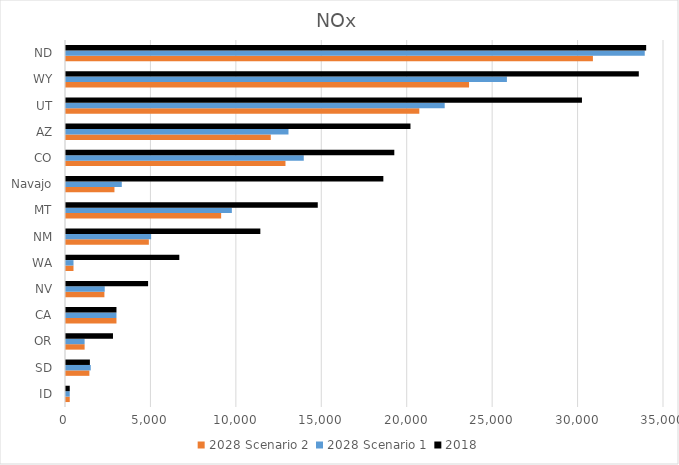
| Category | 2028 Scenario 2 | 2028 Scenario 1 | 2018 |
|---|---|---|---|
| ID | 219.893 | 219.893 | 219.893 |
| SD | 1368.645 | 1449.126 | 1398.176 |
| OR | 1089.447 | 1089.447 | 2749.745 |
| CA | 2953.774 | 2953.774 | 2953.774 |
| NV | 2247.63 | 2267.371 | 4804.428 |
| WA | 438.839 | 438.839 | 6632.219 |
| NM | 4849.091 | 4983.509 | 11374.592 |
| MT | 9080.44 | 9706.899 | 14735.277 |
| Navajo | 2836.015 | 3265 | 18573.938 |
| CO | 12845.5 | 13916.496 | 19215.546 |
| AZ | 11984.848 | 13021.207 | 20161.311 |
| UT | 20679.457 | 22164.974 | 30197.586 |
| WY | 23589.879 | 25805.99 | 33525.551 |
| ND | 30839.283 | 33873.428 | 33956.368 |